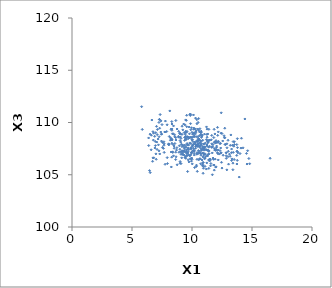
| Category | Series 0 |
|---|---|
| 10.901508904489038 | 106.145 |
| 12.145793151521302 | 107.03 |
| 11.434217759694812 | 106.457 |
| 6.3850084298747385 | 108.521 |
| 7.176947140655388 | 108.417 |
| 9.670634223605564 | 107.223 |
| 12.67272344650577 | 108.73 |
| 11.431428630816619 | 107.001 |
| 11.359011072844716 | 107.342 |
| 12.431922739038928 | 107.102 |
| 13.30245713891043 | 106.36 |
| 12.49990422843831 | 105.637 |
| 10.024515015585322 | 106.038 |
| 10.534838308191535 | 107.315 |
| 8.335005881317102 | 108.32 |
| 10.950177970211582 | 107.091 |
| 8.950135794437525 | 107.774 |
| 10.716010670757683 | 107.034 |
| 10.337895083893567 | 109.181 |
| 10.469657858611765 | 108.181 |
| 9.160861556855565 | 107.687 |
| 14.001390604199727 | 107.028 |
| 9.841585631346371 | 106.526 |
| 10.767236352649599 | 108.735 |
| 9.557153013341917 | 110.691 |
| 8.262514506521379 | 107.176 |
| 9.530721415074478 | 107.393 |
| 11.985085949182801 | 108.112 |
| 8.386538769498333 | 107.191 |
| 13.727993258587452 | 106.854 |
| 7.7288172711548375 | 109.092 |
| 9.582219380270601 | 107.145 |
| 7.501411799820003 | 109.798 |
| 10.405772387626921 | 110.275 |
| 10.702421377722702 | 107.08 |
| 9.486219812256211 | 108.406 |
| 10.927903425832618 | 107.639 |
| 7.657392144321399 | 107.819 |
| 10.158117412115041 | 109.463 |
| 8.278136938498305 | 105.745 |
| 9.140519007093548 | 106.62 |
| 9.878188795802865 | 109.888 |
| 7.685997733271941 | 107.956 |
| 9.58929667649101 | 108.642 |
| 9.997544990388269 | 109.06 |
| 9.302802456481055 | 107.244 |
| 8.337411967508297 | 109.38 |
| 9.58842538705304 | 107.988 |
| 8.638121267422559 | 106.456 |
| 6.780096631151501 | 108.316 |
| 10.759841254111981 | 107.825 |
| 13.04909330932606 | 106.014 |
| 10.430450931656265 | 107.124 |
| 10.592241658111789 | 108.404 |
| 7.202981239946433 | 107.862 |
| 9.474795955545176 | 109.157 |
| 10.880022981606846 | 107.069 |
| 9.36735035010613 | 107.483 |
| 13.517892055735196 | 106.459 |
| 7.400686818340837 | 109.086 |
| 7.540141251815639 | 107.617 |
| 9.28386578077642 | 107.281 |
| 12.146579853978869 | 108.11 |
| 12.856487880963778 | 107.097 |
| 14.805061859835902 | 106.05 |
| 6.977765316804238 | 109.026 |
| 9.144039339888758 | 107.219 |
| 9.43545405017744 | 108.876 |
| 10.781045526555308 | 107.962 |
| 11.025944210086351 | 107.356 |
| 10.17481584394538 | 108.694 |
| 7.0637983566325095 | 108.129 |
| 9.423769013483273 | 107.187 |
| 13.52972587254579 | 107.896 |
| 10.599055201818203 | 107.726 |
| 10.287833848434545 | 107.887 |
| 11.698270179102138 | 105.001 |
| 8.065147914290641 | 107.872 |
| 9.791400643108373 | 108.533 |
| 11.940644289014468 | 108.158 |
| 10.174070809007866 | 108.63 |
| 9.243505840707828 | 106.941 |
| 8.4579683598367 | 106.812 |
| 6.613007561565963 | 108.781 |
| 10.505602296581724 | 107.936 |
| 9.17102416380509 | 109.645 |
| 7.68065282871185 | 107.137 |
| 11.815783425583401 | 108.56 |
| 11.690014131161949 | 107.087 |
| 10.284784105349905 | 108.084 |
| 9.504872342916473 | 109.064 |
| 10.12319252151768 | 107.341 |
| 13.41115753637884 | 106.108 |
| 10.766059488805887 | 109.169 |
| 11.09435418779791 | 106.995 |
| 10.489813774974284 | 108.641 |
| 9.038385921629217 | 107.201 |
| 10.057960638073341 | 108.878 |
| 12.037608546288284 | 107.597 |
| 10.68546316936145 | 108.267 |
| 9.862712745009567 | 110.671 |
| 11.74849545032959 | 107.874 |
| 11.973158299153939 | 105.729 |
| 9.482731030305906 | 108.404 |
| 10.582565035657046 | 108.316 |
| 12.753941333201475 | 107.903 |
| 11.646291652010841 | 108.76 |
| 9.221067532548469 | 107.105 |
| 10.403130931201911 | 106.966 |
| 8.314413986481124 | 110.085 |
| 13.483017039681899 | 107.731 |
| 7.927616102532062 | 109.779 |
| 10.93501475231696 | 106.176 |
| 10.800876802568638 | 107.327 |
| 11.242992091893479 | 108.857 |
| 10.757515647796849 | 107.471 |
| 8.740009248895127 | 107.588 |
| 10.667737151092798 | 106.528 |
| 8.709450643105445 | 107.363 |
| 16.510412606121044 | 106.576 |
| 12.125542350711747 | 109.534 |
| 10.239484848171372 | 108.866 |
| 10.498908576238957 | 108.313 |
| 14.405109235814388 | 110.339 |
| 8.884952724378241 | 108.595 |
| 11.40486794008665 | 107.29 |
| 11.36746240804433 | 108.135 |
| 7.087502055642476 | 107.425 |
| 11.719943744192626 | 107.662 |
| 9.26085686057328 | 107.77 |
| 7.447401751839612 | 108.873 |
| 7.098135995285386 | 108.843 |
| 11.875196029826075 | 107.499 |
| 10.635208878791532 | 109.093 |
| 12.39333669019273 | 107.562 |
| 14.122928141286252 | 108.494 |
| 8.062155630814003 | 107.865 |
| 13.936347834507977 | 104.78 |
| 12.792216478282667 | 107.88 |
| 11.83990741202145 | 105.933 |
| 10.987814395505755 | 106.899 |
| 11.85922116879507 | 105.443 |
| 9.106875043428127 | 107.917 |
| 8.298086617915857 | 108.348 |
| 9.959576903626388 | 109.499 |
| 11.844630442048828 | 109.345 |
| 10.918503316136333 | 106.706 |
| 10.123240105088476 | 110.72 |
| 9.917197313931963 | 107.972 |
| 9.659192455422257 | 107.417 |
| 13.17480043555783 | 106.766 |
| 10.085576844041364 | 108.17 |
| 10.441489755984628 | 105.325 |
| 6.596757777359737 | 107.387 |
| 7.250481067802625 | 107.286 |
| 10.287066685776603 | 109.384 |
| 10.764589194116914 | 108.216 |
| 9.531420791752463 | 108.39 |
| 10.837760020144247 | 106.414 |
| 14.253775063280797 | 107.576 |
| 13.327371176715873 | 106.515 |
| 8.646600501163878 | 108.547 |
| 8.244759357487023 | 109.366 |
| 6.990225553392001 | 106.997 |
| 6.4596623351877085 | 105.399 |
| 10.434138229473064 | 107.743 |
| 8.518992642385552 | 107.537 |
| 9.471487416148188 | 108.679 |
| 12.39700822159272 | 107.074 |
| 7.3021585925399926 | 109.456 |
| 9.07743689044538 | 108.481 |
| 10.80378095209198 | 108.824 |
| 11.087510853354987 | 107.409 |
| 9.384272526463779 | 108.57 |
| 8.671618094233228 | 106.717 |
| 11.57196395430518 | 106.068 |
| 6.888957443921994 | 108.678 |
| 11.0397211363302 | 108.888 |
| 9.482477593726948 | 106.573 |
| 9.305103999228793 | 109.848 |
| 11.259157082154854 | 109.365 |
| 9.819388887978588 | 108.043 |
| 10.040196924884182 | 107.771 |
| 8.106667087345063 | 108.661 |
| 12.32889731012115 | 107.982 |
| 11.439281717211673 | 108.314 |
| 10.959765360950982 | 107.425 |
| 11.047951677308435 | 106.525 |
| 12.054092221917388 | 107.742 |
| 8.460562714002908 | 109.672 |
| 10.554523107782309 | 110.38 |
| 9.68997423639274 | 107.486 |
| 14.738868778675341 | 106.553 |
| 11.195374190602877 | 105.544 |
| 10.720048413913691 | 107.873 |
| 11.292231254540592 | 106.793 |
| 9.91243924786813 | 107.557 |
| 8.565076961510162 | 108.624 |
| 7.9596000394956405 | 106.073 |
| 10.038774315270807 | 108.593 |
| 8.643018118934027 | 107.156 |
| 7.3118413197432295 | 106.989 |
| 10.757788008416703 | 106.868 |
| 10.47614307778365 | 107.893 |
| 9.00874814206715 | 108.273 |
| 9.42203492020685 | 106.645 |
| 7.785261589636551 | 110.136 |
| 11.64760349503863 | 107.961 |
| 11.235919641291783 | 106.132 |
| 13.780201632148545 | 108.454 |
| 11.314606942761591 | 108.902 |
| 6.7487834449104165 | 106.612 |
| 7.247901120876018 | 110.007 |
| 9.352319535144002 | 106.883 |
| 6.7481123392906355 | 109.117 |
| 14.636256209052942 | 107.298 |
| 11.890475117370967 | 107.362 |
| 11.543722686168579 | 106.424 |
| 9.205787503492274 | 107.864 |
| 8.663055514706627 | 108.323 |
| 12.078366099589806 | 108.106 |
| 10.613071619024153 | 108.722 |
| 9.563588646482037 | 107.043 |
| 5.855564689752805 | 109.333 |
| 7.286230322581936 | 110.299 |
| 10.00801454645087 | 107.691 |
| 9.523025272639368 | 110.202 |
| 8.326083778797148 | 108.015 |
| 10.865093276928016 | 107.433 |
| 14.58334195135855 | 106.025 |
| 9.836789652646676 | 108.568 |
| 10.92452526893328 | 105.14 |
| 10.58728262685263 | 107.093 |
| 11.753294873372317 | 106.6 |
| 13.822211368057523 | 107.107 |
| 11.082942467760214 | 105.802 |
| 13.299929526916735 | 107.459 |
| 10.642885913541827 | 107.714 |
| 13.002569015025092 | 108.299 |
| 10.656661877945325 | 106.534 |
| 11.471032095829598 | 108.303 |
| 9.539588874769649 | 106.835 |
| 8.972785850402822 | 108.929 |
| 8.328235273931808 | 108.394 |
| 11.197614647932658 | 108.363 |
| 10.386635488577575 | 107.728 |
| 10.63775534563611 | 107.262 |
| 11.097544535752494 | 108.022 |
| 9.611189826247672 | 108.632 |
| 10.955044711648936 | 107.952 |
| 11.95021119345311 | 107.376 |
| 12.496887105583296 | 108.945 |
| 9.05579286813929 | 108.884 |
| 9.902862769611952 | 106.907 |
| 11.352149485547445 | 106.957 |
| 6.514392005777074 | 105.205 |
| 13.79016195209475 | 107.594 |
| 8.994991216806092 | 108.987 |
| 10.659072121807144 | 109.404 |
| 10.363919250239887 | 105.799 |
| 10.719647010575098 | 106.05 |
| 9.958607530134747 | 107.081 |
| 10.564028088113858 | 107.036 |
| 9.810879092524422 | 106.804 |
| 11.03080145382052 | 107.646 |
| 13.73280066070233 | 107.885 |
| 10.5069253107138 | 110.007 |
| 8.075385959360458 | 107.926 |
| 10.480051405897097 | 107.715 |
| 9.648715175479618 | 107.076 |
| 11.849304426557547 | 108.109 |
| 7.470832213547499 | 108.896 |
| 13.78473994878556 | 107.228 |
| 9.811804653882975 | 110.788 |
| 9.699313126803673 | 106.889 |
| 6.948805612046866 | 107.786 |
| 9.63428300220742 | 105.312 |
| 11.20559689534565 | 107.4 |
| 13.410265227825551 | 105.482 |
| 7.534263190656181 | 108.085 |
| 7.118690253813782 | 109.329 |
| 13.001748556038216 | 106.731 |
| 12.458326780991927 | 106.191 |
| 9.788368293875784 | 108.918 |
| 9.412749170253349 | 109.775 |
| 9.741013837228675 | 107.415 |
| 10.070541739240031 | 107.842 |
| 9.081109105474882 | 106.069 |
| 10.3250817508968 | 107.908 |
| 11.209235393469312 | 109.578 |
| 9.74451381321066 | 106.227 |
| 8.307325827898584 | 106.683 |
| 10.408837427701771 | 107.777 |
| 10.741494923800726 | 109.062 |
| 11.016451477395135 | 107.918 |
| 10.31957089247132 | 109.015 |
| 10.18694063783667 | 107.261 |
| 11.661933844307226 | 107.682 |
| 13.026027245901115 | 107.249 |
| 8.415433559911108 | 107.897 |
| 14.540679244008448 | 107.039 |
| 11.307217243986052 | 108.044 |
| 8.052194452983723 | 107.956 |
| 8.510274771148165 | 107.75 |
| 13.533839693596983 | 108.161 |
| 8.331540251457145 | 109.858 |
| 10.14164308477132 | 109.357 |
| 11.957218576356379 | 108.029 |
| 9.9468283711205 | 106.299 |
| 10.889698899230012 | 108.307 |
| 11.801007520833364 | 105.927 |
| 12.594046105817966 | 106.87 |
| 10.126743916783797 | 108.968 |
| 8.197069172375821 | 108.308 |
| 12.187505339431999 | 106.415 |
| 8.992344018110433 | 107.436 |
| 8.320143588896476 | 109.251 |
| 10.171676683577301 | 107.057 |
| 10.186770295608104 | 107.328 |
| 9.601133638351858 | 107.887 |
| 10.415473096748926 | 109.879 |
| 11.462065657506729 | 107.73 |
| 8.150741893377319 | 111.109 |
| 10.898236953715209 | 107.701 |
| 9.509290323513083 | 107.257 |
| 10.614941671921134 | 108.038 |
| 11.404234044642982 | 109.348 |
| 12.719700401280445 | 108.526 |
| 7.285839815127735 | 110.301 |
| 11.085063219659848 | 106.588 |
| 10.420444515491038 | 106.477 |
| 9.451164596540828 | 108.556 |
| 10.691134311165733 | 108.099 |
| 11.281305292346989 | 107.345 |
| 9.817860771098951 | 106.848 |
| 12.917077384150415 | 107.581 |
| 11.505176356885155 | 106.508 |
| 13.74311676439604 | 106.028 |
| 9.16480012744084 | 108.866 |
| 11.142990036418995 | 106.732 |
| 8.75891643023614 | 109.378 |
| 7.931697301682359 | 106.636 |
| 12.90507346547498 | 105.468 |
| 9.363373661261509 | 107.619 |
| 11.389643728686986 | 106.408 |
| 9.88957248767213 | 110.79 |
| 7.893140662009216 | 109.137 |
| 10.784549784290832 | 108.572 |
| 9.012593947857942 | 106.264 |
| 9.090571545643712 | 106.95 |
| 12.845217828976224 | 106.82 |
| 9.503604739537844 | 109.063 |
| 10.403780884376314 | 108.254 |
| 9.688152520887261 | 107.574 |
| 12.174748418142409 | 107.374 |
| 9.19644919376127 | 107.29 |
| 12.858843251499835 | 106.57 |
| 9.919719161240915 | 107.45 |
| 11.095759988303557 | 107.649 |
| 8.889376668317194 | 109.154 |
| 10.30487465654683 | 107.696 |
| 10.2255862899157 | 108.128 |
| 11.388667678621928 | 107.636 |
| 11.260766145048459 | 106.859 |
| 6.90995429701458 | 107.561 |
| 9.720897439355108 | 107.846 |
| 12.12284906023316 | 107.121 |
| 10.476853408777474 | 109.377 |
| 10.749617359447516 | 109.054 |
| 8.258221146429593 | 108.437 |
| 11.797815070770316 | 106.475 |
| 9.97631470742366 | 106.601 |
| 13.187854114116188 | 107.815 |
| 9.95374659321189 | 106.541 |
| 7.254187803638965 | 108.639 |
| 9.029121840182968 | 108.617 |
| 10.557751961827565 | 109.242 |
| 9.986731321160002 | 108.341 |
| 9.34833501933335 | 109.027 |
| 7.347238404772158 | 110.758 |
| 11.610658069971723 | 108.346 |
| 7.657810330991253 | 108.154 |
| 13.237909027799828 | 108.809 |
| 13.124699710343412 | 106.977 |
| 11.003119012171174 | 106.988 |
| 12.724329018426795 | 108.555 |
| 9.562722817265396 | 109.594 |
| 12.194039986378002 | 109.101 |
| 9.599665870837873 | 107.093 |
| 11.54907090686281 | 105.851 |
| 9.40066212042013 | 107.828 |
| 9.898252725513313 | 109.305 |
| 9.951844124570805 | 107.143 |
| 11.910382182209103 | 108.905 |
| 10.527838672315612 | 108.478 |
| 11.252397708742361 | 107.847 |
| 8.550067679141355 | 108.817 |
| 12.561874081388245 | 108.232 |
| 10.192482736899848 | 106.884 |
| 13.36979218345342 | 107.825 |
| 10.668961117779242 | 107.614 |
| 12.272664991057322 | 106.978 |
| 12.437027535554709 | 110.928 |
| 5.801767186191213 | 111.512 |
| 9.15094810769205 | 107.009 |
| 8.653240116542115 | 110.191 |
| 9.385970609066021 | 108.289 |
| 10.039553268135728 | 108.365 |
| 9.349299930827097 | 107.257 |
| 7.756100138829345 | 106 |
| 12.005332367797408 | 108.27 |
| 10.862709403758727 | 105.887 |
| 7.046855353942513 | 109.631 |
| 10.450748894594124 | 108.194 |
| 12.376494544800476 | 108.008 |
| 11.935663627060457 | 106.498 |
| 11.4045035143582 | 105.61 |
| 12.854153126240027 | 107.104 |
| 8.372426471476608 | 108.919 |
| 9.663078768109562 | 108.614 |
| 10.290687165135534 | 107.529 |
| 6.798750281698492 | 108.973 |
| 9.95345874891362 | 107.121 |
| 8.869554358584182 | 108.675 |
| 10.95635804810252 | 105.62 |
| 12.037064993268636 | 107.376 |
| 8.438041015042256 | 108.919 |
| 10.345797287334461 | 108.643 |
| 10.93400278303067 | 105.818 |
| 9.236504935737987 | 109.292 |
| 9.58028693415238 | 109.145 |
| 10.845009299209238 | 108.772 |
| 12.335285639146026 | 107.305 |
| 10.899335771815506 | 105.992 |
| 12.730902318526535 | 109.453 |
| 6.655514323359787 | 110.237 |
| 9.627058964595717 | 107.839 |
| 8.57489062895294 | 107.99 |
| 13.430152345876525 | 108.169 |
| 12.906088077241485 | 107.959 |
| 10.297624712056242 | 110.422 |
| 10.18478766106596 | 109.028 |
| 9.474835191929186 | 110.247 |
| 9.004362170428116 | 106.101 |
| 6.507231809298069 | 108.884 |
| 7.76927716225666 | 109.095 |
| 10.904491345861903 | 107.573 |
| 11.4628635831485 | 106.317 |
| 11.390550012308005 | 107.238 |
| 13.77210954065617 | 106.375 |
| 10.038150225064978 | 107.257 |
| 10.413952685352555 | 107.027 |
| 11.015302340284608 | 107.543 |
| 10.993089027113616 | 107.46 |
| 13.734653354485136 | 107.251 |
| 9.60135158064618 | 106.827 |
| 11.643184131769257 | 107.615 |
| 9.687771508286254 | 106.422 |
| 9.701946605203421 | 108.468 |
| 8.392213728609875 | 107.135 |
| 12.1410741985824 | 108.771 |
| 11.273433816510659 | 108.207 |
| 6.714679944532048 | 106.284 |
| 12.42446231007643 | 108.98 |
| 6.8106013770477025 | 106.62 |
| 9.257652945375833 | 106.934 |
| 11.2531788716921 | 107.759 |
| 7.019546891840695 | 106.483 |
| 11.261165935263525 | 108.594 |
| 6.393823901593757 | 107.796 |
| 10.37254040579797 | 105.917 |
| 13.296047290326271 | 107.117 |
| 8.212400931736143 | 108.531 |
| 13.436944278974892 | 107.14 |
| 10.568107141680448 | 106.432 |
| 10.219022220825403 | 105.683 |
| 9.058825144218263 | 108.129 |
| 7.410825757240476 | 110.153 |
| 10.49516355778438 | 107.742 |
| 9.866935877903591 | 108.597 |
| 8.763283925907867 | 105.952 |
| 6.937408192975906 | 108.186 |
| 10.114274871706229 | 107.534 |
| 9.962619192733907 | 108.568 |
| 7.618993276104076 | 107.522 |
| 10.727460797551366 | 108.866 |
| 9.49597241177702 | 107.644 |
| 8.917537428618388 | 107.15 |
| 9.758680104738719 | 109.566 |
| 7.459222328717319 | 108.223 |
| 11.979897003744147 | 107.32 |
| 10.827707953185275 | 108.7 |
| 12.212052353503674 | 108.196 |
| 9.995907218199463 | 106.462 |
| 10.164516339978796 | 109.367 |
| 11.99890428997302 | 105.763 |
| 14.082221470877792 | 107.55 |
| 10.169848198819576 | 107.948 |
| 11.330868737311208 | 108.281 |
| 9.440999612714354 | 106.696 |